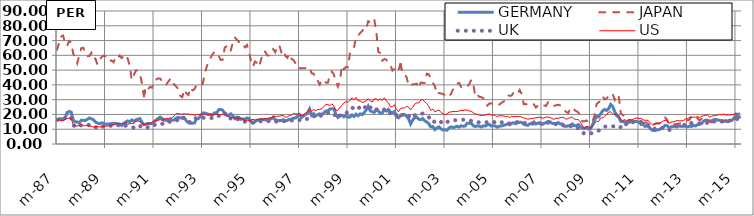
| Category | GERMANY | JAPAN | UK | US |
|---|---|---|---|---|
| 1987-03-01 | 16 | 63.8 | 16.4 | 16.1 |
| 1987-04-01 | 17.1 | 68.2 | 16.1 | 16.2 |
| 1987-05-01 | 17.1 | 72.7 | 16.7 | 15.8 |
| 1987-06-01 | 16.6 | 73.4 | 17.4 | 15.8 |
| 1987-07-01 | 17.6 | 68.1 | 17.3 | 16.6 |
| 1987-08-01 | 21.3 | 66.5 | 18.4 | 17.2 |
| 1987-09-01 | 22 | 69.7 | 17.7 | 17.6 |
| 1987-10-01 | 21.6 | 68.6 | 17.9 | 17 |
| 1987-11-01 | 16.3 | 61.2 | 13 | 13.3 |
| 1987-12-01 | 14.9 | 58.8 | 11.4 | 12.1 |
| 1988-01-01 | 15 | 54.7 | 12.2 | 12.2 |
| 1988-02-01 | 14.2 | 59.9 | 12.6 | 12.6 |
| 1988-03-01 | 16.1 | 64.8 | 12.6 | 13.2 |
| 1988-04-01 | 16 | 65.1 | 12.2 | 12.3 |
| 1988-05-01 | 15.9 | 62 | 12.6 | 12.3 |
| 1988-06-01 | 16.7 | 59.3 | 12.6 | 12.6 |
| 1988-07-01 | 17.6 | 59.6 | 13 | 12.1 |
| 1988-08-01 | 17.1 | 61.7 | 12.4 | 12.1 |
| 1988-09-01 | 16.4 | 57.2 | 11.2 | 11.5 |
| 1988-10-01 | 14.9 | 57.8 | 11.2 | 11.7 |
| 1988-11-01 | 14.2 | 53.7 | 11.6 | 11.9 |
| 1988-12-01 | 13.7 | 56.8 | 10.9 | 11.5 |
| 1989-01-01 | 14.3 | 58.7 | 10.8 | 11.7 |
| 1989-02-01 | 14.1 | 59.8 | 12.2 | 12.3 |
| 1989-03-01 | 13.3 | 59.4 | 12.1 | 11.9 |
| 1989-04-01 | 13.6 | 59.4 | 12.2 | 12.2 |
| 1989-05-01 | 13.6 | 56.4 | 12.5 | 12.4 |
| 1989-06-01 | 13.8 | 56.5 | 12.2 | 12.9 |
| 1989-07-01 | 13.8 | 55.3 | 12.4 | 12.8 |
| 1989-08-01 | 14 | 58.8 | 13 | 13.5 |
| 1989-09-01 | 13.6 | 57.9 | 12.9 | 13.9 |
| 1989-10-01 | 13.5 | 59.9 | 12.2 | 13.8 |
| 1989-11-01 | 12.5 | 58.1 | 11.4 | 13.8 |
| 1989-12-01 | 13.8 | 59.4 | 12 | 14.2 |
| 1990-01-01 | 14.9 | 60.6 | 12.4 | 14.3 |
| 1990-02-01 | 15.6 | 57.7 | 12.1 | 13.5 |
| 1990-03-01 | 15 | 52.8 | 11.8 | 13.7 |
| 1990-04-01 | 16.3 | 43.3 | 11.6 | 13.9 |
| 1990-05-01 | 15.4 | 46.6 | 11 | 13.9 |
| 1990-06-01 | 16.3 | 49.7 | 12.4 | 15.5 |
| 1990-07-01 | 16.8 | 49.7 | 12.5 | 15.5 |
| 1990-08-01 | 17.2 | 47.7 | 12.3 | 15.2 |
| 1990-09-01 | 14.8 | 41.1 | 11.4 | 13.7 |
| 1990-10-01 | 13.1 | 32.3 | 10.6 | 13.4 |
| 1990-11-01 | 13.4 | 38.8 | 10.7 | 13.2 |
| 1990-12-01 | 14 | 37.1 | 11.3 | 13.9 |
| 1991-01-01 | 13.5 | 38.6 | 11.2 | 14.2 |
| 1991-02-01 | 13.9 | 38.1 | 11.3 | 14.4 |
| 1991-03-01 | 14.9 | 42.8 | 12.6 | 15.7 |
| 1991-04-01 | 16.3 | 43.5 | 13.5 | 15.8 |
| 1991-05-01 | 17.2 | 44.4 | 14 | 16.1 |
| 1991-06-01 | 18.2 | 44.4 | 13.8 | 16.5 |
| 1991-07-01 | 17.3 | 42.5 | 13.6 | 16 |
| 1991-08-01 | 16 | 42.1 | 14.6 | 16.8 |
| 1991-09-01 | 16.1 | 40 | 15.2 | 17.3 |
| 1991-10-01 | 15.7 | 42.1 | 15.4 | 17.1 |
| 1991-11-01 | 16.5 | 44 | 14.9 | 17.7 |
| 1991-12-01 | 16.1 | 40.1 | 14.7 | 17.5 |
| 1992-01-01 | 16.2 | 40.5 | 15.1 | 19.2 |
| 1992-02-01 | 17.5 | 38.8 | 15.7 | 20.6 |
| 1992-03-01 | 18.1 | 37.4 | 16.7 | 20.6 |
| 1992-04-01 | 17.6 | 32.6 | 15.8 | 20.2 |
| 1992-05-01 | 17.7 | 31.7 | 17.5 | 20.2 |
| 1992-06-01 | 17.8 | 36.9 | 17.8 | 20.5 |
| 1992-07-01 | 15.7 | 34.3 | 16.2 | 20.2 |
| 1992-08-01 | 14.4 | 33.2 | 15.5 | 20.4 |
| 1992-09-01 | 14.1 | 38.1 | 14.5 | 19.9 |
| 1992-10-01 | 14.1 | 36.3 | 16.3 | 20 |
| 1992-11-01 | 14.2 | 37 | 17.1 | 19.4 |
| 1992-12-01 | 17 | 39.8 | 17.6 | 19.9 |
| 1993-01-01 | 17.2 | 40.3 | 18 | 20.1 |
| 1993-02-01 | 18.9 | 40.4 | 18.2 | 19.8 |
| 1993-03-01 | 21 | 40.1 | 17.9 | 20 |
| 1993-04-01 | 20.9 | 47 | 17.6 | 20.1 |
| 1993-05-01 | 20.6 | 51.8 | 17.3 | 19.6 |
| 1993-06-01 | 20 | 55.9 | 17.3 | 20 |
| 1993-07-01 | 19.9 | 58.5 | 17.5 | 19.9 |
| 1993-08-01 | 19.8 | 60.7 | 17.7 | 19.5 |
| 1993-09-01 | 21.1 | 62.4 | 18.6 | 20.1 |
| 1993-10-01 | 21 | 60.4 | 18.2 | 20 |
| 1993-11-01 | 23.2 | 59.7 | 19 | 20.1 |
| 1993-12-01 | 23.4 | 56.9 | 19.2 | 19.8 |
| 1994-01-01 | 22.8 | 57 | 20.5 | 20 |
| 1994-02-01 | 20.5 | 65.3 | 21.1 | 20.4 |
| 1994-03-01 | 19.5 | 66.2 | 19.2 | 19.2 |
| 1994-04-01 | 19.3 | 62.8 | 17 | 18.4 |
| 1994-05-01 | 20.4 | 63.2 | 17.3 | 17.9 |
| 1994-06-01 | 19.2 | 68.7 | 16.3 | 18 |
| 1994-07-01 | 17.2 | 72.1 | 16.1 | 17.5 |
| 1994-08-01 | 18.2 | 70.6 | 16.8 | 17.4 |
| 1994-09-01 | 18.1 | 69.2 | 16.7 | 17.6 |
| 1994-10-01 | 16.7 | 66.8 | 15.3 | 17.3 |
| 1994-11-01 | 17 | 67.1 | 15.5 | 16.6 |
| 1994-12-01 | 16.8 | 65.4 | 15.1 | 15.8 |
| 1995-01-01 | 17.6 | 67 | 15.1 | 16.2 |
| 1995-02-01 | 17.3 | 62.3 | 14.7 | 15.7 |
| 1995-03-01 | 15.1 | 56.2 | 14.6 | 16.2 |
| 1995-04-01 | 14.1 | 52.4 | 14.6 | 16.7 |
| 1995-05-01 | 15.1 | 55.8 | 14.9 | 16.2 |
| 1995-06-01 | 16 | 54.8 | 15.3 | 16.6 |
| 1995-07-01 | 16 | 52.3 | 15.1 | 17.1 |
| 1995-08-01 | 16.6 | 57.1 | 15.5 | 16.7 |
| 1995-09-01 | 16.5 | 62.4 | 15.5 | 16.8 |
| 1995-10-01 | 16.4 | 62.5 | 15.3 | 17.3 |
| 1995-11-01 | 16 | 60 | 15.2 | 17.1 |
| 1995-12-01 | 16.9 | 59.8 | 15.6 | 17.6 |
| 1996-01-01 | 17 | 62.7 | 15.6 | 17.8 |
| 1996-02-01 | 18.2 | 64.2 | 16 | 18.7 |
| 1996-03-01 | 16.3 | 62.1 | 15.2 | 18.6 |
| 1996-04-01 | 16.1 | 65.8 | 15.1 | 18.8 |
| 1996-05-01 | 15.8 | 67 | 15.7 | 18.9 |
| 1996-06-01 | 15.9 | 62.2 | 15.6 | 19.2 |
| 1996-07-01 | 16.4 | 63.8 | 15.4 | 19.4 |
| 1996-08-01 | 15.7 | 59.7 | 15.4 | 18.2 |
| 1996-09-01 | 16 | 58.3 | 15.7 | 18.3 |
| 1996-10-01 | 16.7 | 61.1 | 16.2 | 19.3 |
| 1996-11-01 | 16.6 | 57.7 | 15.9 | 19.4 |
| 1996-12-01 | 17.5 | 56.8 | 16 | 20.8 |
| 1997-01-01 | 17.6 | 54.7 | 16.2 | 20.4 |
| 1997-02-01 | 18.7 | 51.1 | 16.8 | 20.4 |
| 1997-03-01 | 19.9 | 51.3 | 16.3 | 20.4 |
| 1997-04-01 | 18.1 | 51.2 | 15.6 | 19.4 |
| 1997-05-01 | 19 | 51.3 | 16.1 | 19.7 |
| 1997-06-01 | 19.9 | 51.3 | 16.7 | 20.8 |
| 1997-07-01 | 20.9 | 52.1 | 17.1 | 21.8 |
| 1997-08-01 | 23.7 | 51.9 | 17.6 | 23.2 |
| 1997-09-01 | 19.4 | 47.9 | 17.6 | 22.2 |
| 1997-10-01 | 20.5 | 47.6 | 19 | 23.5 |
| 1997-11-01 | 19 | 43.2 | 17.8 | 22.6 |
| 1997-12-01 | 19.9 | 42.8 | 17.8 | 23.4 |
| 1998-01-01 | 20.4 | 40.2 | 18.5 | 23.4 |
| 1998-02-01 | 19.9 | 42.9 | 19.7 | 23.9 |
| 1998-03-01 | 21 | 43.6 | 20.4 | 25.1 |
| 1998-04-01 | 22.3 | 41.6 | 20.8 | 26.7 |
| 1998-05-01 | 22.4 | 41.4 | 21.2 | 26.8 |
| 1998-06-01 | 23.7 | 46.2 | 21 | 25.8 |
| 1998-07-01 | 23.8 | 49 | 21 | 27.2 |
| 1998-08-01 | 23.8 | 47.2 | 20.9 | 25.8 |
| 1998-09-01 | 20.1 | 42.2 | 18.3 | 22.8 |
| 1998-10-01 | 18 | 38.8 | 17.3 | 22.8 |
| 1998-11-01 | 19 | 42.8 | 19.4 | 24.9 |
| 1998-12-01 | 19.4 | 53.1 | 19.4 | 26.2 |
| 1999-01-01 | 18.4 | 50.5 | 20.6 | 27.7 |
| 1999-02-01 | 19.2 | 52.2 | 21.1 | 28.8 |
| 1999-03-01 | 18.1 | 51.9 | 21.5 | 28.1 |
| 1999-04-01 | 18.3 | 61.7 | 22.9 | 29.5 |
| 1999-05-01 | 19.6 | 64.3 | 24.6 | 31.3 |
| 1999-06-01 | 18.6 | 65.3 | 24 | 29.9 |
| 1999-07-01 | 20.2 | 72.5 | 25.6 | 31.6 |
| 1999-08-01 | 19.1 | 73.4 | 25.1 | 29.2 |
| 1999-09-01 | 20.4 | 75 | 24 | 29.2 |
| 1999-10-01 | 19.8 | 76.4 | 22.9 | 28.1 |
| 1999-11-01 | 21.2 | 78.5 | 24.4 | 28.5 |
| 1999-12-01 | 23 | 77.9 | 25.4 | 29.2 |
| 2000-01-01 | 25.6 | 83.1 | 26.7 | 30.6 |
| 2000-02-01 | 22.4 | 82.2 | 24.6 | 29.2 |
| 2000-03-01 | 21.9 | 84.6 | 25.5 | 28.3 |
| 2000-04-01 | 21.4 | 84.4 | 23.6 | 30.5 |
| 2000-05-01 | 23.1 | 76.1 | 23.5 | 30.5 |
| 2000-06-01 | 22.4 | 62.3 | 23 | 29.5 |
| 2000-07-01 | 20.7 | 61.6 | 23 | 30.5 |
| 2000-08-01 | 21.1 | 56.4 | 22.4 | 29.6 |
| 2000-09-01 | 23.4 | 57.5 | 23.3 | 31.3 |
| 2000-10-01 | 22.3 | 57.1 | 21.4 | 29.1 |
| 2000-11-01 | 23.4 | 54.4 | 21.8 | 27.9 |
| 2000-12-01 | 21.6 | 53.6 | 20.6 | 25.1 |
| 2001-01-01 | 21.1 | 49.7 | 21 | 25.3 |
| 2001-02-01 | 22 | 50.8 | 21.4 | 26.5 |
| 2001-03-01 | 18.4 | 48.7 | 19.5 | 23.5 |
| 2001-04-01 | 17.7 | 49.9 | 18.7 | 21.8 |
| 2001-05-01 | 19.1 | 54.2 | 20.5 | 24.1 |
| 2001-06-01 | 20 | 47.7 | 19.4 | 24.4 |
| 2001-07-01 | 19.9 | 47 | 20.3 | 24.3 |
| 2001-08-01 | 18.8 | 45.3 | 19.6 | 25.5 |
| 2001-09-01 | 17 | 39.6 | 19.3 | 25 |
| 2001-10-01 | 13.6 | 39.2 | 17.3 | 23.1 |
| 2001-11-01 | 16.2 | 40.4 | 18.6 | 24.7 |
| 2001-12-01 | 17.8 | 40.4 | 19.5 | 27 |
| 2002-01-01 | 18.2 | 40.8 | 19.9 | 27.8 |
| 2002-02-01 | 16.8 | 37.7 | 19.7 | 27.7 |
| 2002-03-01 | 16.4 | 41.6 | 20.1 | 29.7 |
| 2002-04-01 | 17.2 | 41.4 | 20.7 | 30.1 |
| 2002-05-01 | 15.7 | 41.2 | 20.2 | 28.5 |
| 2002-06-01 | 14.9 | 47.6 | 19.6 | 27.3 |
| 2002-07-01 | 13.7 | 47.2 | 18.2 | 25.4 |
| 2002-08-01 | 11.6 | 43.9 | 15.8 | 22.7 |
| 2002-09-01 | 11.8 | 41.3 | 16.3 | 23.6 |
| 2002-10-01 | 9.7 | 39.2 | 14.5 | 21.8 |
| 2002-11-01 | 10.9 | 33.6 | 15 | 22.5 |
| 2002-12-01 | 11.6 | 34.5 | 15.7 | 23 |
| 2003-01-01 | 10.3 | 34.3 | 14.9 | 21.4 |
| 2003-02-01 | 9.5 | 33.7 | 13.7 | 20.6 |
| 2003-03-01 | 9.7 | 33.1 | 14.9 | 19.7 |
| 2003-04-01 | 9.3 | 31.6 | 14.8 | 20.3 |
| 2003-05-01 | 10.9 | 32 | 15.6 | 21.6 |
| 2003-06-01 | 11.6 | 34 | 16 | 21.7 |
| 2003-07-01 | 11.1 | 37 | 15.6 | 22 |
| 2003-08-01 | 11.5 | 38 | 16.1 | 21.9 |
| 2003-09-01 | 12 | 40.9 | 16.2 | 22.1 |
| 2003-10-01 | 11.4 | 41.3 | 16.1 | 22.3 |
| 2003-11-01 | 12.3 | 38.6 | 16.4 | 22.8 |
| 2003-12-01 | 12 | 37.8 | 16.4 | 22.6 |
| 2004-01-01 | 12.2 | 38.5 | 16.5 | 23.1 |
| 2004-02-01 | 14.1 | 38.7 | 16.3 | 22.9 |
| 2004-03-01 | 14.1 | 40.5 | 16.3 | 22.4 |
| 2004-04-01 | 13.9 | 43.4 | 15.6 | 22.1 |
| 2004-05-01 | 12.4 | 40.9 | 15.7 | 21.2 |
| 2004-06-01 | 11.8 | 32.2 | 15.1 | 20.3 |
| 2004-07-01 | 12.3 | 33.4 | 15.1 | 20.1 |
| 2004-08-01 | 12.1 | 31.9 | 14.5 | 19.5 |
| 2004-09-01 | 11.5 | 31.7 | 14.4 | 19.1 |
| 2004-10-01 | 12.3 | 31 | 14.8 | 19.5 |
| 2004-11-01 | 12.2 | 28.7 | 14.7 | 19.5 |
| 2004-12-01 | 12.8 | 26 | 14.8 | 20.1 |
| 2005-01-01 | 13.3 | 27.5 | 15.1 | 20.3 |
| 2005-02-01 | 12.1 | 27.3 | 15.4 | 19.5 |
| 2005-03-01 | 12.4 | 27.9 | 15 | 19.6 |
| 2005-04-01 | 12.1 | 28.1 | 14.6 | 19.1 |
| 2005-05-01 | 11.4 | 26.8 | 13.8 | 18.6 |
| 2005-06-01 | 12.1 | 26.8 | 14.3 | 19.2 |
| 2005-07-01 | 12.2 | 27.9 | 14.7 | 19.1 |
| 2005-08-01 | 12.7 | 28.7 | 14.5 | 19 |
| 2005-09-01 | 13 | 30 | 14.3 | 18.6 |
| 2005-10-01 | 13.6 | 33 | 14.7 | 18.7 |
| 2005-11-01 | 13 | 32.6 | 13.8 | 17.9 |
| 2005-12-01 | 14 | 32.8 | 14.1 | 18.8 |
| 2006-01-01 | 14.4 | 34.9 | 14.5 | 18.5 |
| 2006-02-01 | 13.7 | 35.6 | 15 | 18.7 |
| 2006-03-01 | 14.4 | 34.2 | 14.8 | 18.5 |
| 2006-04-01 | 14.7 | 36.6 | 14.8 | 18.6 |
| 2006-05-01 | 14.6 | 33.7 | 14.9 | 18.2 |
| 2006-06-01 | 13.3 | 26.9 | 14.1 | 17.5 |
| 2006-07-01 | 12.9 | 27.1 | 14.3 | 17.4 |
| 2006-08-01 | 12.6 | 26.4 | 13.8 | 16.7 |
| 2006-09-01 | 13.7 | 27.5 | 13.7 | 17.1 |
| 2006-10-01 | 13.9 | 27.3 | 13.6 | 17.3 |
| 2006-11-01 | 14.9 | 26.8 | 14 | 17.5 |
| 2006-12-01 | 13.5 | 24.7 | 13.6 | 17.7 |
| 2007-01-01 | 14.2 | 26.1 | 14 | 17.9 |
| 2007-02-01 | 14 | 27 | 14.2 | 18.2 |
| 2007-03-01 | 13.2 | 27 | 13.5 | 17.5 |
| 2007-04-01 | 13.9 | 26.1 | 13.8 | 17.6 |
| 2007-05-01 | 14.5 | 25.7 | 14.1 | 18.2 |
| 2007-06-01 | 15.2 | 28.3 | 14.4 | 18.2 |
| 2007-07-01 | 15.1 | 28.4 | 14.1 | 18 |
| 2007-08-01 | 14 | 26.7 | 13.3 | 17.2 |
| 2007-09-01 | 13.8 | 25.8 | 13.2 | 16.7 |
| 2007-10-01 | 13.8 | 26.2 | 13.5 | 17.5 |
| 2007-11-01 | 14.5 | 26.6 | 13.8 | 17.3 |
| 2007-12-01 | 13.5 | 26.1 | 13.1 | 17.9 |
| 2008-01-01 | 13.6 | 25.2 | 13.2 | 18 |
| 2008-02-01 | 12.1 | 22.8 | 12.2 | 17.7 |
| 2008-03-01 | 11.9 | 21.7 | 11.8 | 16.8 |
| 2008-04-01 | 12.3 | 21 | 11.8 | 17.2 |
| 2008-05-01 | 12.6 | 23.8 | 12.2 | 18 |
| 2008-06-01 | 13.6 | 24.9 | 11.6 | 18.1 |
| 2008-07-01 | 12.3 | 23.2 | 10.4 | 16.9 |
| 2008-08-01 | 12.5 | 22.2 | 10.3 | 16.6 |
| 2008-09-01 | 13.1 | 21.4 | 10.9 | 16.6 |
| 2008-10-01 | 11.9 | 19.2 | 9.6 | 14.9 |
| 2008-11-01 | 10.7 | 15.4 | 8.1 | 12.6 |
| 2008-12-01 | 10.6 | 15.4 | 6.9 | 10.5 |
| 2009-01-01 | 11.2 | 16 | 7.1 | 11.7 |
| 2009-02-01 | 10.1 | 14.7 | 6.8 | 11.8 |
| 2009-03-01 | 10.2 | 14.1 | 7 | 10.6 |
| 2009-04-01 | 12.9 | 15.2 | 7.6 | 12.4 |
| 2009-05-01 | 16.2 | 19.2 | 8.5 | 13.8 |
| 2009-06-01 | 18.7 | 26.9 | 8.9 | 15.5 |
| 2009-07-01 | 18.3 | 28.2 | 9 | 15.1 |
| 2009-08-01 | 20.3 | 29.1 | 10.5 | 17.5 |
| 2009-09-01 | 22.4 | 32.3 | 11.3 | 17.8 |
| 2009-10-01 | 23.4 | 30.2 | 11.8 | 18.5 |
| 2009-11-01 | 22.7 | 30.8 | 11.8 | 19.9 |
| 2009-12-01 | 23.9 | 32.5 | 12.2 | 21.6 |
| 2010-01-01 | 26.8 | 34.2 | 12.4 | 21.8 |
| 2010-02-01 | 25.4 | 33.8 | 12 | 20.5 |
| 2010-03-01 | 21.9 | 29.9 | 11.8 | 19.9 |
| 2010-04-01 | 19.1 | 33.4 | 12.6 | 20.7 |
| 2010-05-01 | 18.1 | 32.4 | 12.2 | 19.3 |
| 2010-06-01 | 15.3 | 20.7 | 11.3 | 16.6 |
| 2010-07-01 | 15.1 | 19.5 | 10.5 | 15.9 |
| 2010-08-01 | 15.1 | 19.1 | 12.2 | 16.5 |
| 2010-09-01 | 14.4 | 16 | 14.1 | 15.5 |
| 2010-10-01 | 14.6 | 16.3 | 14.8 | 16.4 |
| 2010-11-01 | 14.9 | 15.6 | 14.9 | 16.4 |
| 2010-12-01 | 15.3 | 15.1 | 14.7 | 16.6 |
| 2011-01-01 | 15.3 | 15.6 | 15.4 | 17.4 |
| 2011-02-01 | 15.2 | 15.6 | 15.4 | 17.6 |
| 2011-03-01 | 14.8 | 15.9 | 15.3 | 17.1 |
| 2011-04-01 | 13.3 | 14.2 | 14.9 | 17.4 |
| 2011-05-01 | 13.5 | 14.3 | 14.1 | 16.4 |
| 2011-06-01 | 11.9 | 14.4 | 13.9 | 16 |
| 2011-07-01 | 12.2 | 14.7 | 13.8 | 16.2 |
| 2011-08-01 | 11.6 | 14.7 | 12.3 | 15.3 |
| 2011-09-01 | 9.9 | 13.9 | 11 | 13.9 |
| 2011-10-01 | 9.1 | 13.4 | 10.1 | 12.5 |
| 2011-11-01 | 9.2 | 13.7 | 10.4 | 14 |
| 2011-12-01 | 9.6 | 13.9 | 10.5 | 14 |
| 2012-01-01 | 9.7 | 13.8 | 10.6 | 14.1 |
| 2012-02-01 | 10.5 | 14.6 | 11.2 | 14.8 |
| 2012-03-01 | 11.3 | 17.2 | 10.4 | 15.6 |
| 2012-04-01 | 12.6 | 17.9 | 10.6 | 16.1 |
| 2012-05-01 | 12.4 | 16.2 | 10.6 | 15.6 |
| 2012-06-01 | 11 | 13 | 9.5 | 14 |
| 2012-07-01 | 11.6 | 14 | 10.2 | 14.9 |
| 2012-08-01 | 11.9 | 13.4 | 11.4 | 15 |
| 2012-09-01 | 12.1 | 13.4 | 11.7 | 15.5 |
| 2012-10-01 | 12.4 | 13.5 | 11.9 | 15.9 |
| 2012-11-01 | 12.1 | 13.8 | 12.3 | 15.7 |
| 2012-12-01 | 11.9 | 14.3 | 12.4 | 15.7 |
| 2013-01-01 | 12.1 | 15.6 | 12.5 | 15.8 |
| 2013-02-01 | 12 | 16.5 | 13.3 | 16.9 |
| 2013-03-01 | 11.6 | 16.1 | 13.8 | 17.3 |
| 2013-04-01 | 12 | 16.4 | 14.8 | 17.8 |
| 2013-05-01 | 11.9 | 18.8 | 14.1 | 17.8 |
| 2013-06-01 | 12.6 | 17.2 | 14 | 18.3 |
| 2013-07-01 | 12.2 | 17.9 | 13.8 | 18.1 |
| 2013-08-01 | 13 | 17.5 | 13.8 | 18.6 |
| 2013-09-01 | 13.3 | 15.9 | 14 | 17.9 |
| 2013-10-01 | 13.8 | 17 | 13.9 | 18.7 |
| 2013-11-01 | 15.5 | 16.7 | 14.5 | 19.1 |
| 2013-12-01 | 16.2 | 16.5 | 14.1 | 19.4 |
| 2014-01-01 | 16 | 16.8 | 14.4 | 19.8 |
| 2014-02-01 | 15.3 | 15.4 | 14 | 18 |
| 2014-03-01 | 15.8 | 14.7 | 15 | 18.9 |
| 2014-04-01 | 16.4 | 14.8 | 15.1 | 19.2 |
| 2014-05-01 | 16.6 | 14.1 | 15.9 | 19.2 |
| 2014-06-01 | 16.2 | 14.6 | 15.7 | 19.6 |
| 2014-07-01 | 16.1 | 15.3 | 15.5 | 20.1 |
| 2014-08-01 | 14.9 | 15.3 | 15.4 | 19.7 |
| 2014-09-01 | 15.4 | 15.6 | 16 | 20.3 |
| 2014-10-01 | 15.3 | 16.1 | 15.3 | 19.6 |
| 2014-11-01 | 15.1 | 15.9 | 15.3 | 19.7 |
| 2014-12-01 | 15.9 | 16.5 | 15.9 | 19.7 |
| 2015-01-01 | 16 | 16.3 | 15.8 | 19.8 |
| 2015-02-01 | 17.5 | 16.2 | 16.2 | 20.1 |
| 2015-03-01 | 19.6 | 17.3 | 17.1 | 21 |
| 2015-04-01 | 18.9 | 17.4 | 16.7 | 20.6 |
| 2015-05-01 | 17.9 | 18 | 17.3 | 21 |